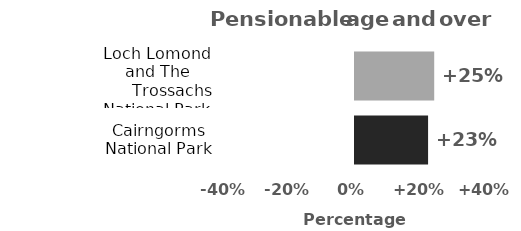
| Category | Pensionable age and over |
|---|---|
| Cairngorms National Park | 22.659 |
| Loch Lomond and The
      Trossachs National Park | 24.563 |